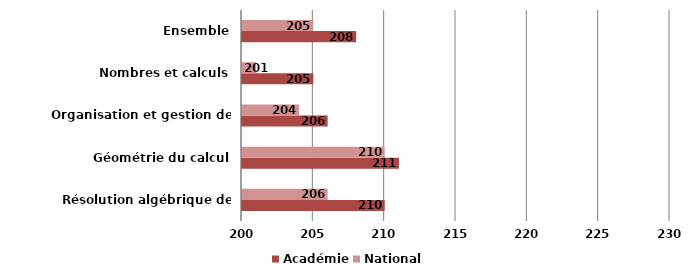
| Category | Académie | National |
|---|---|---|
| Résolution algébrique de problèmes | 210 | 206 |
| Géométrie du calcul | 211 | 210 |
| Organisation et gestion de données | 206 | 204 |
| Nombres et calculs | 205 | 201 |
| Ensemble | 208 | 205 |